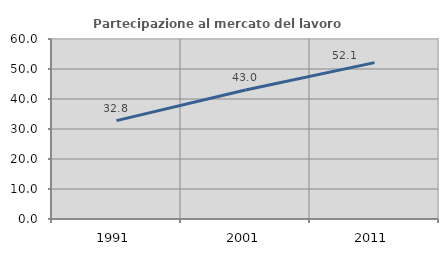
| Category | Partecipazione al mercato del lavoro  femminile |
|---|---|
| 1991.0 | 32.792 |
| 2001.0 | 43.024 |
| 2011.0 | 52.126 |